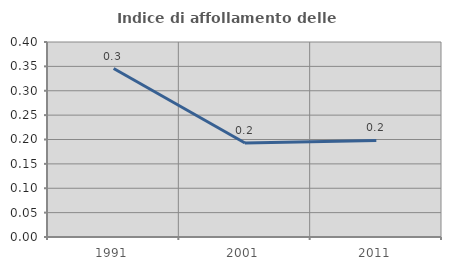
| Category | Indice di affollamento delle abitazioni  |
|---|---|
| 1991.0 | 0.346 |
| 2001.0 | 0.193 |
| 2011.0 | 0.198 |